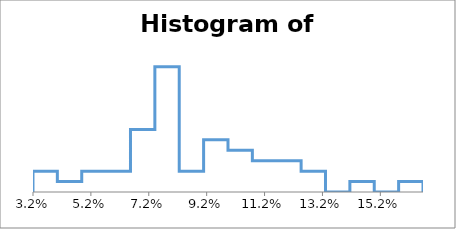
| Category | Series 0 |
|---|---|
| 0.03199091657005004 | 0 |
| 0.03199091657005004 | 2 |
| 0.04041275278762693 | 2 |
| 0.04041275278762693 | 1 |
| 0.04883458900520382 | 1 |
| 0.04883458900520382 | 2 |
| 0.05725642522278071 | 2 |
| 0.05725642522278071 | 2 |
| 0.0656782614403576 | 2 |
| 0.0656782614403576 | 6 |
| 0.07410009765793449 | 6 |
| 0.07410009765793449 | 12 |
| 0.08252193387551138 | 12 |
| 0.08252193387551138 | 2 |
| 0.09094377009308827 | 2 |
| 0.09094377009308827 | 5 |
| 0.09936560631066516 | 5 |
| 0.09936560631066516 | 4 |
| 0.10778744252824204 | 4 |
| 0.10778744252824204 | 3 |
| 0.11620927874581893 | 3 |
| 0.11620927874581893 | 3 |
| 0.12463111496339582 | 3 |
| 0.12463111496339582 | 2 |
| 0.1330529511809727 | 2 |
| 0.1330529511809727 | 0 |
| 0.1414747873985496 | 0 |
| 0.1414747873985496 | 1 |
| 0.1498966236161265 | 1 |
| 0.1498966236161265 | 0 |
| 0.15831845983370338 | 0 |
| 0.15831845983370338 | 1 |
| 0.16674029605128027 | 1 |
| 0.16674029605128027 | 0 |